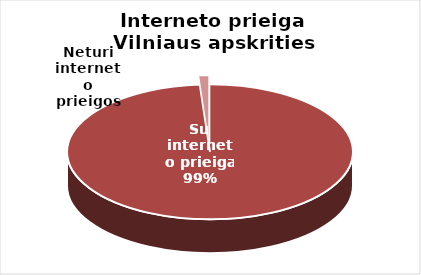
| Category | Series 0 |
|---|---|
| Su interneto prieiga  | 174 |
| Neturi interneto prieigos | 2 |